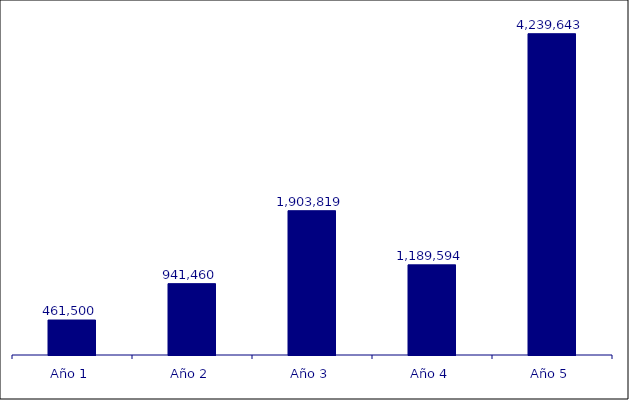
| Category | Año 1 Año 2 Año 3 Año 4 Año 5 |
|---|---|
| Año 1 | 461500 |
| Año 2 | 941460 |
| Año 3 | 1903818.525 |
| Año 4 | 1189594.38 |
| Año 5 | 4239643.35 |